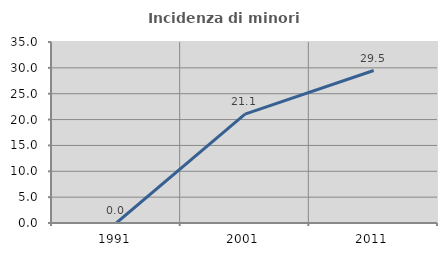
| Category | Incidenza di minori stranieri |
|---|---|
| 1991.0 | 0 |
| 2001.0 | 21.053 |
| 2011.0 | 29.487 |